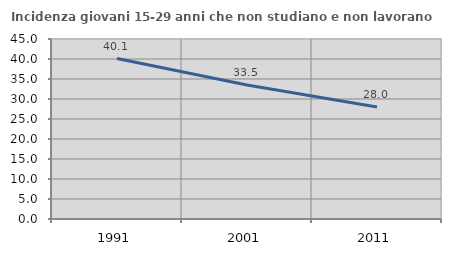
| Category | Incidenza giovani 15-29 anni che non studiano e non lavorano  |
|---|---|
| 1991.0 | 40.102 |
| 2001.0 | 33.488 |
| 2011.0 | 28 |